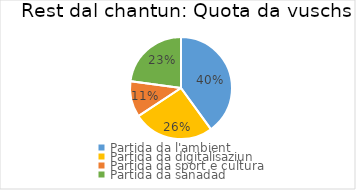
| Category | Quota da vuschs |
|---|---|
| Partida da l'ambient | 0.4 |
| Partida da digitalisaziun | 0.257 |
| Partida da sport e cultura  | 0.114 |
| Partida da sanadad  | 0.229 |